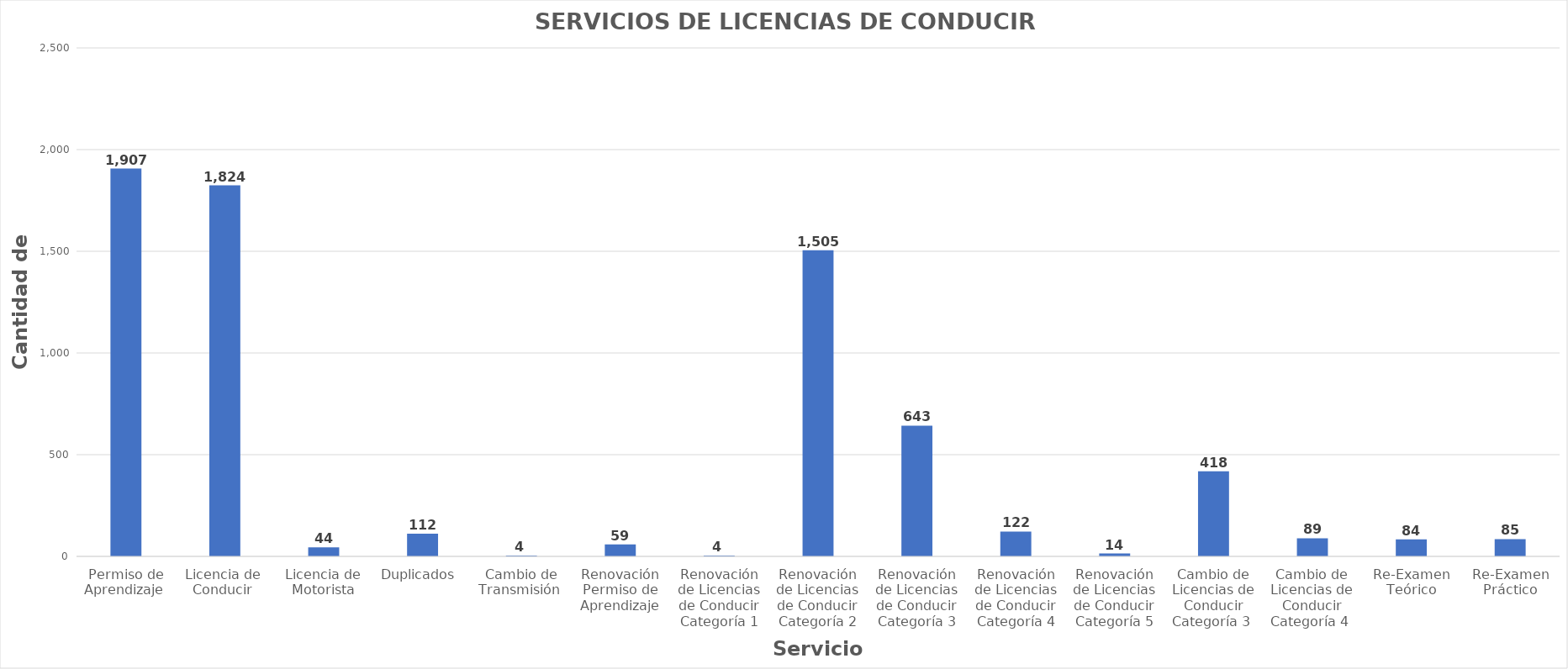
| Category | Series 0 |
|---|---|
| Permiso de Aprendizaje  | 1907 |
| Licencia de  Conducir  | 1824 |
| Licencia de Motorista | 44 |
| Duplicados  | 112 |
| Cambio de Transmisión  | 4 |
| Renovación Permiso de Aprendizaje | 59 |
| Renovación de Licencias de Conducir Categoría 1 | 4 |
| Renovación de Licencias de Conducir Categoría 2 | 1505 |
| Renovación de Licencias de Conducir Categoría 3 | 643 |
| Renovación de Licencias de Conducir Categoría 4 | 122 |
| Renovación de Licencias de Conducir Categoría 5 | 14 |
| Cambio de Licencias de Conducir Categoría 3  | 418 |
| Cambio de Licencias de Conducir Categoría 4  | 89 |
| Re-Examen Teórico | 84 |
| Re-Examen Práctico | 85 |